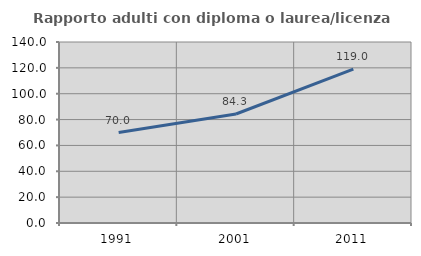
| Category | Rapporto adulti con diploma o laurea/licenza media  |
|---|---|
| 1991.0 | 70 |
| 2001.0 | 84.321 |
| 2011.0 | 118.976 |